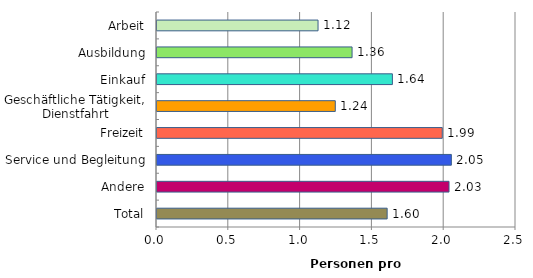
| Category | Series 0 |
|---|---|
| Arbeit | 1.121 |
| Ausbildung | 1.358 |
| Einkauf | 1.639 |
| Geschäftliche Tätigkeit, Dienstfahrt | 1.242 |
| Freizeit | 1.986 |
| Service und Begleitung | 2.05 |
| Andere | 2.034 |
| Total | 1.603 |